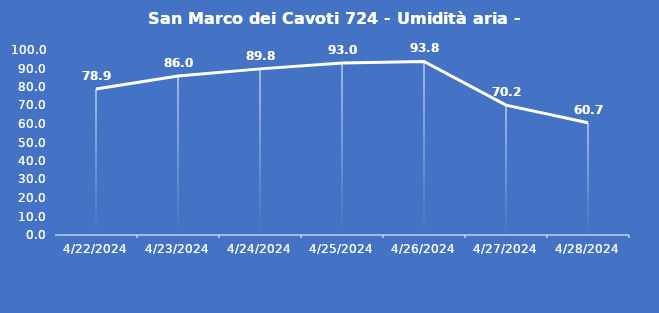
| Category | San Marco dei Cavoti 724 - Umidità aria - Grezzo (%) |
|---|---|
| 4/22/24 | 78.9 |
| 4/23/24 | 86 |
| 4/24/24 | 89.8 |
| 4/25/24 | 93 |
| 4/26/24 | 93.8 |
| 4/27/24 | 70.2 |
| 4/28/24 | 60.7 |